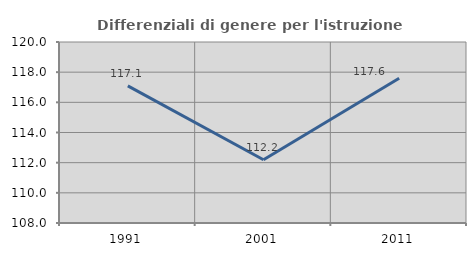
| Category | Differenziali di genere per l'istruzione superiore |
|---|---|
| 1991.0 | 117.093 |
| 2001.0 | 112.194 |
| 2011.0 | 117.598 |